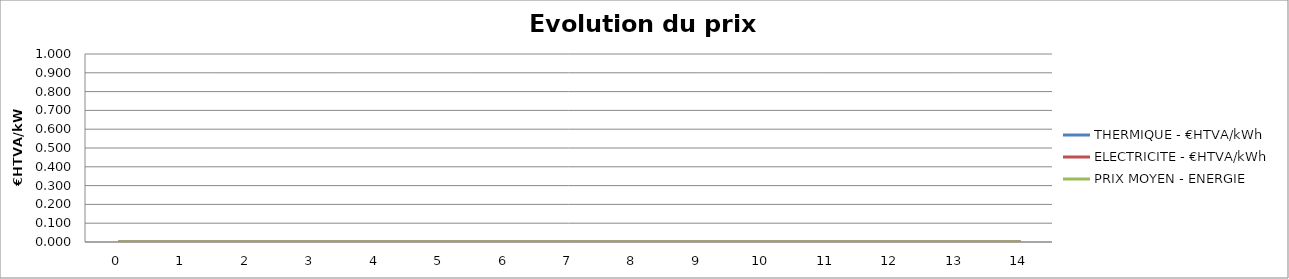
| Category | THERMIQUE - €HTVA/kWh | ELECTRICITE - €HTVA/kWh | PRIX MOYEN - ENERGIE |
|---|---|---|---|
| 0.0 | 0 | 0 | 0 |
| 1.0 | 0 | 0 | 0 |
| 2.0 | 0 | 0 | 0 |
| 3.0 | 0 | 0 | 0 |
| 4.0 | 0 | 0 | 0 |
| 5.0 | 0 | 0 | 0 |
| 6.0 | 0 | 0 | 0 |
| 7.0 | 0 | 0 | 0 |
| 8.0 | 0 | 0 | 0 |
| 9.0 | 0 | 0 | 0 |
| 10.0 | 0 | 0 | 0 |
| 11.0 | 0 | 0 | 0 |
| 12.0 | 0 | 0 | 0 |
| 13.0 | 0 | 0 | 0 |
| 14.0 | 0 | 0 | 0 |